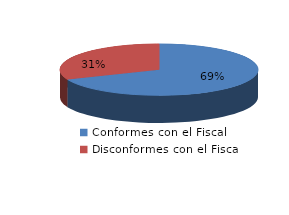
| Category | Series 0 |
|---|---|
| 0 | 1902 |
| 1 | 868 |